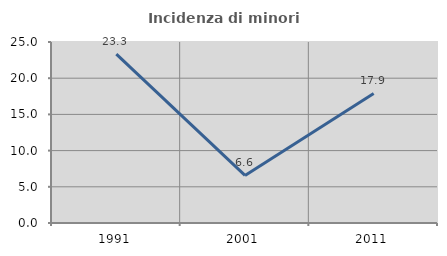
| Category | Incidenza di minori stranieri |
|---|---|
| 1991.0 | 23.333 |
| 2001.0 | 6.571 |
| 2011.0 | 17.89 |